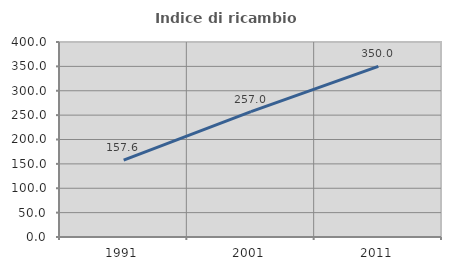
| Category | Indice di ricambio occupazionale  |
|---|---|
| 1991.0 | 157.595 |
| 2001.0 | 257.037 |
| 2011.0 | 350 |